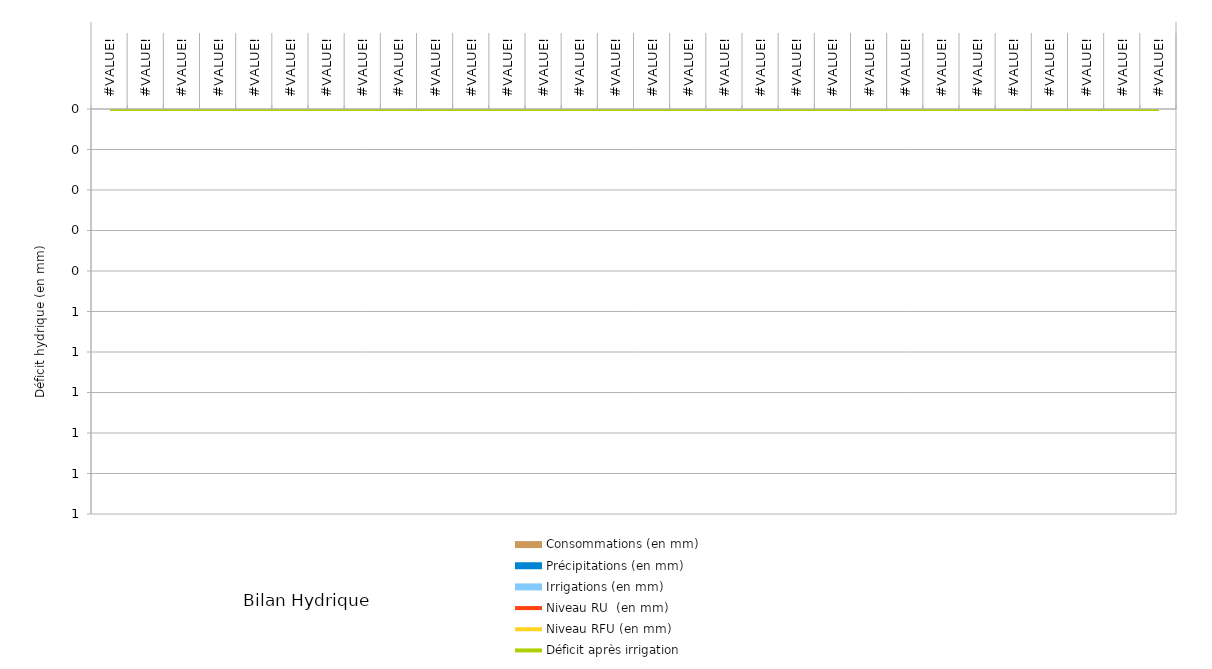
| Category | Consommations (en mm) | Précipitations (en mm) | Irrigations (en mm) |
|---|---|---|---|
| #VALEUR! |  | 0 | 0 |
| #VALEUR! |  | 0 | 0 |
| #VALEUR! |  | 0 | 0 |
| #VALEUR! |  | 0 | 0 |
| #VALEUR! |  | 0 | 0 |
| #VALEUR! |  | 0 | 0 |
| #VALEUR! |  | 0 | 0 |
| #VALEUR! |  | 0 | 0 |
| #VALEUR! |  | 0 | 0 |
| #VALEUR! |  | 0 | 0 |
| #VALEUR! |  | 0 | 0 |
| #VALEUR! |  | 0 | 0 |
| #VALEUR! |  | 0 | 0 |
| #VALEUR! |  | 0 | 0 |
| #VALEUR! |  | 0 | 0 |
| #VALEUR! |  | 0 | 0 |
| #VALEUR! |  | 0 | 0 |
| #VALEUR! |  | 0 | 0 |
| #VALEUR! |  | 0 | 0 |
| #VALEUR! |  | 0 | 0 |
| #VALEUR! |  | 0 | 0 |
| #VALEUR! |  | 0 | 0 |
| #VALEUR! |  | 0 | 0 |
| #VALEUR! |  | 0 | 0 |
| #VALEUR! |  | 0 | 0 |
| #VALEUR! |  | 0 | 0 |
| #VALEUR! |  | 0 | 0 |
| #VALEUR! |  | 0 | 0 |
| #VALEUR! |  | 0 | 0 |
| #VALEUR! |  | 0 | 0 |